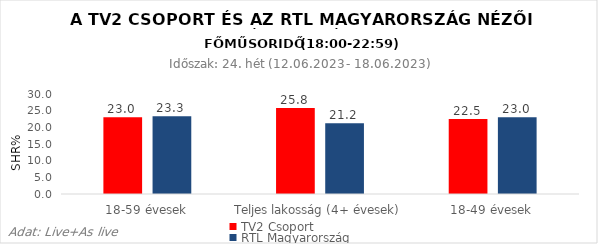
| Category | TV2 Csoport | RTL Magyarország |
|---|---|---|
| 18-59 évesek | 23 | 23.3 |
| Teljes lakosság (4+ évesek) | 25.8 | 21.2 |
| 18-49 évesek | 22.5 | 23 |